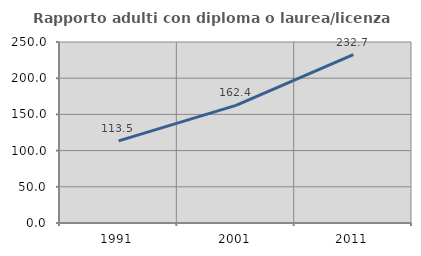
| Category | Rapporto adulti con diploma o laurea/licenza media  |
|---|---|
| 1991.0 | 113.472 |
| 2001.0 | 162.434 |
| 2011.0 | 232.716 |